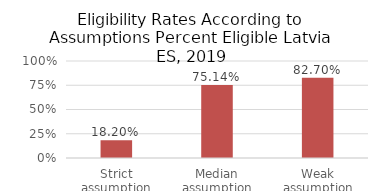
| Category | Series 0 |
|---|---|
| Strict assumption | 0.182 |
| Median assumption | 0.751 |
| Weak assumption | 0.827 |